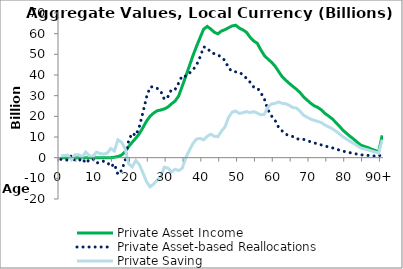
| Category | Private Asset Income | Private Asset-based Reallocations | Private Saving |
|---|---|---|---|
| 0 | 0 | -817.573 | 817.573 |
|  | 0 | -1067.041 | 1067.041 |
| 2 | 0 | -1201.225 | 1201.225 |
| 3 | 0 | 999.636 | -999.636 |
| 4 | 0 | -1430.826 | 1430.826 |
| 5 | 0 | -1455.627 | 1455.627 |
| 6 | 0 | -379.232 | 379.232 |
| 7 | 0 | -2703.467 | 2703.467 |
| 8 | 0 | -938.427 | 938.427 |
| 9 | 0 | -641.262 | 641.262 |
| 10 | 0 | -2661.019 | 2661.019 |
| 11 | 0 | -2054.698 | 2054.698 |
| 12 | 0.516 | -1719.661 | 1720.177 |
| 13 | 2.686 | -2197.69 | 2200.376 |
| 14 | 7.141 | -4407.092 | 4414.233 |
| 15 | 200.148 | -3018.565 | 3218.714 |
| 16 | 545.843 | -8128.671 | 8674.514 |
| 17 | 1228.263 | -6242.557 | 7470.82 |
| 18 | 2936.395 | -1585.802 | 4522.197 |
| 19 | 5326.156 | 8355.622 | -3029.466 |
| 20 | 7447.268 | 11879.476 | -4432.208 |
| 21 | 9394.478 | 10703.011 | -1308.532 |
| 22 | 11616.763 | 15024.881 | -3408.118 |
| 23 | 14535.381 | 21822.646 | -7287.265 |
| 24 | 17672.795 | 29290.062 | -11617.267 |
| 25 | 20038.923 | 34156.348 | -14117.425 |
| 26 | 21588.392 | 34365.051 | -12776.659 |
| 27 | 22714.771 | 33533.437 | -10818.666 |
| 28 | 23052.966 | 32203.348 | -9150.382 |
| 29 | 23607.635 | 28182.473 | -4574.838 |
| 30 | 24506.476 | 29514.99 | -5008.514 |
| 31 | 26043.613 | 32958.366 | -6914.753 |
| 32 | 27372.751 | 32988.511 | -5615.76 |
| 33 | 29828.329 | 36067.171 | -6238.841 |
| 34 | 34542.581 | 39703.009 | -5160.428 |
| 35 | 39368.267 | 39389.913 | -21.646 |
| 36 | 44352.967 | 40829.355 | 3523.611 |
| 37 | 49323.485 | 42499.386 | 6824.098 |
| 38 | 53838.82 | 44828.109 | 9010.711 |
| 39 | 58035.766 | 48709.462 | 9326.305 |
| 40 | 62175.247 | 53569.889 | 8605.357 |
| 41 | 63503.636 | 53176.759 | 10326.877 |
| 42 | 62242.509 | 50911.907 | 11330.602 |
| 43 | 60660.485 | 50308.649 | 10351.836 |
| 44 | 59909.532 | 49770.067 | 10139.465 |
| 45 | 61289.37 | 48466.701 | 12822.668 |
| 46 | 61952.996 | 46963.479 | 14989.518 |
| 47 | 62897.286 | 43313.17 | 19584.116 |
| 48 | 63765.864 | 41719.461 | 22046.403 |
| 49 | 64057.734 | 41502.806 | 22554.929 |
| 50 | 62676.274 | 41278.098 | 21398.176 |
| 51 | 61834.364 | 40094.362 | 21740.002 |
| 52 | 60657.43 | 38350.61 | 22306.819 |
| 53 | 58300.229 | 36533.675 | 21766.554 |
| 54 | 56452.43 | 34176.93 | 22275.499 |
| 55 | 55381.468 | 33777.255 | 21604.213 |
| 56 | 52184.297 | 31437.765 | 20746.532 |
| 57 | 49425.238 | 28408.271 | 21016.968 |
| 58 | 47720.926 | 23211.628 | 24509.298 |
| 59 | 46189.727 | 20200.201 | 25989.526 |
| 60 | 44296.016 | 18060.13 | 26235.886 |
| 61 | 41656.275 | 14680.187 | 26976.087 |
| 62 | 39146.502 | 12887.921 | 26258.581 |
| 63 | 37463.739 | 11367.423 | 26096.316 |
| 64 | 35902.336 | 10613.269 | 25289.067 |
| 65 | 34453.996 | 10214.166 | 24239.83 |
| 66 | 33081.835 | 9078.918 | 24002.918 |
| 67 | 31482.433 | 9031.488 | 22450.945 |
| 68 | 29355.622 | 8857.402 | 20498.22 |
| 69 | 27819.567 | 8227.531 | 19592.035 |
| 70 | 26275.606 | 7678.591 | 18597.015 |
| 71 | 25084.113 | 7081.868 | 18002.245 |
| 72 | 24254.954 | 6745.307 | 17509.646 |
| 73 | 23064.983 | 6128.018 | 16936.965 |
| 74 | 21366.667 | 5603.642 | 15763.025 |
| 75 | 20135.164 | 5224.619 | 14910.544 |
| 76 | 18794.633 | 4773.934 | 14020.699 |
| 77 | 17056.4 | 4165.907 | 12890.493 |
| 78 | 15244.132 | 3665.029 | 11579.103 |
| 79 | 13280.444 | 3147.167 | 10133.278 |
| 80 | 11765.499 | 2784.713 | 8980.786 |
| 81 | 10314.346 | 2407.238 | 7907.108 |
| 82 | 8980.724 | 2067.008 | 6913.716 |
| 83 | 7465.467 | 1704.971 | 5760.496 |
| 84 | 6071.841 | 1377.426 | 4694.415 |
| 85 | 5449.343 | 1228.509 | 4220.834 |
| 86 | 4873.816 | 1098.411 | 3775.405 |
| 87 | 4120.342 | 905.402 | 3214.94 |
| 88 | 3479.268 | 752.454 | 2726.814 |
| 89 | 2787.004 | 572.883 | 2214.121 |
| 90+ | 10817.312 | 2143.741 | 8673.571 |